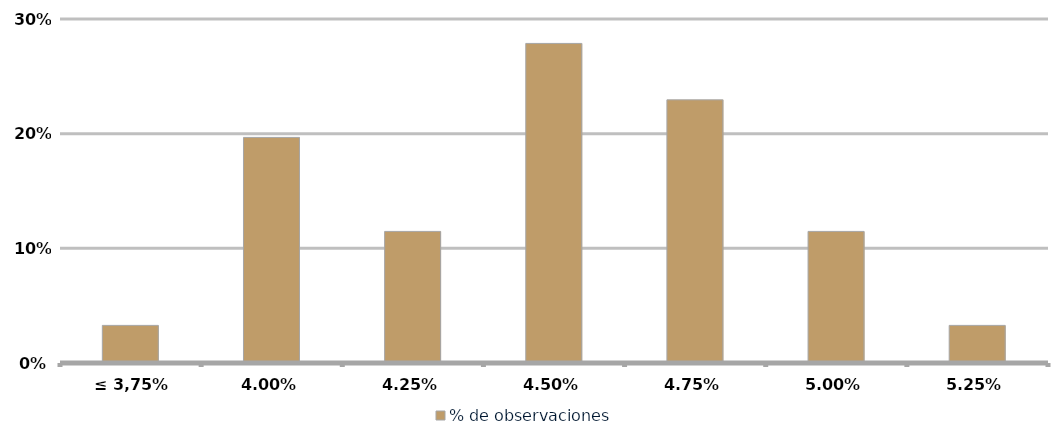
| Category | % de observaciones  |
|---|---|
| ≤ 3,75% | 0.033 |
| 4.00% | 0.197 |
| 4.25% | 0.115 |
| 4.50% | 0.279 |
| 4.75% | 0.23 |
| 5.00% | 0.115 |
| 5.25% | 0.033 |